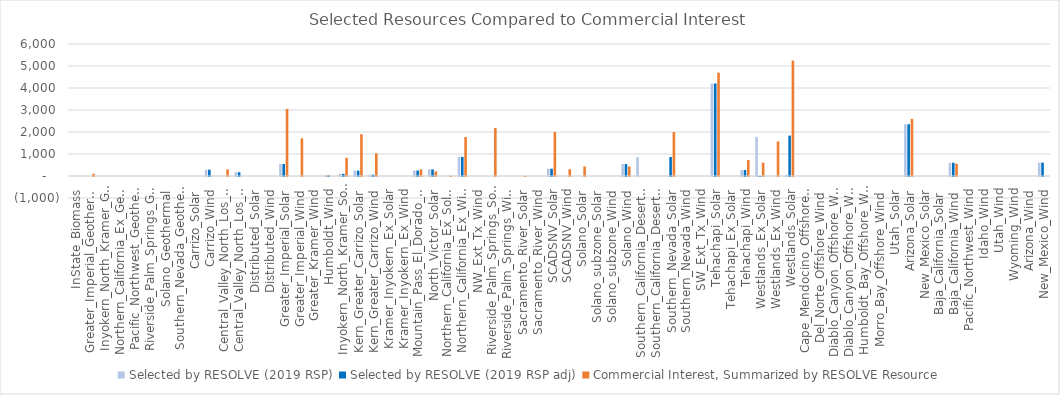
| Category | Selected by RESOLVE (2019 RSP) | Selected by RESOLVE (2019 RSP adj) |  Commercial Interest, Summarized by RESOLVE Resource  |
|---|---|---|---|
| InState_Biomass | 0 | 0 | 0 |
| Greater_Imperial_Geothermal | 0 | 0 | 100 |
| Inyokern_North_Kramer_Geothermal | 0 | 0 | 0 |
| Northern_California_Ex_Geothermal | 0 | 0 | 0 |
| Pacific_Northwest_Geothermal | 0 | 0 | 0 |
| Riverside_Palm_Springs_Geothermal | 0 | 0 | 0 |
| Solano_Geothermal | 0 | 0 | 0 |
| Southern_Nevada_Geothermal | 0 | 0 | 0 |
| Carrizo_Solar | 0 | 0 | 0 |
| Carrizo_Wind | 287 | 287 | 0 |
| Central_Valley_North_Los_Banos_Solar | 0 | 0 | 298.35 |
| Central_Valley_North_Los_Banos_Wind | 173 | 173 | 0 |
| Distributed_Solar | 0 | 0 | 0 |
| Distributed_Wind | 0 | 0 | 0 |
| Greater_Imperial_Solar | 547.9 | 547.9 | 3050.58 |
| Greater_Imperial_Wind | 0 | 0 | 1715.3 |
| Greater_Kramer_Wind | 0 | 0 | 0 |
| Humboldt_Wind | 34 | 34 | 0 |
| Inyokern_North_Kramer_Solar | 97 | 97 | 824.26 |
| Kern_Greater_Carrizo_Solar | 241.66 | 241.66 | 1898.196 |
| Kern_Greater_Carrizo_Wind | 60 | 60 | 1030.2 |
| Kramer_Inyokern_Ex_Solar | 0 | 0 | 0 |
| Kramer_Inyokern_Ex_Wind | 0 | 0 | 0 |
| Mountain_Pass_El_Dorado_Solar | 248 | 248 | 300 |
| North_Victor_Solar | 300 | 300 | 210.88 |
| Northern_California_Ex_Solar | 0 | 0 | 20.6 |
| Northern_California_Ex_Wind | 865.9 | 865.9 | 1774 |
| NW_Ext_Tx_Wind | 0 | 0 | 0 |
| Riverside_Palm_Springs_Solar | 0 | 0 | 2182 |
| Riverside_Palm_Springs_Wind | 0 | 0 | 0 |
| Sacramento_River_Solar | 0 | 0 | 12 |
| Sacramento_River_Wind | 0 | 0 | 0 |
| SCADSNV_Solar | 330 | 330 | 2000.104 |
| SCADSNV_Wind | 0 | 0 | 310 |
| Solano_Solar | 0 | 0 | 431.4 |
| Solano_subzone_Solar | 0 | 0 | 0 |
| Solano_subzone_Wind | 0 | 0 | 0 |
| Solano_Wind | 542 | 542 | 433.704 |
| Southern_California_Desert_Ex_Solar | 862 | 0 | 0 |
| Southern_California_Desert_Ex_Wind | 0 | 0 | 0 |
| Southern_Nevada_Solar | 0 | 862 | 2000.104 |
| Southern_Nevada_Wind | 0 | 0 | 0 |
| SW_Ext_Tx_Wind | 0 | 0 | 0 |
| Tehachapi_Solar | 4202 | 4202 | 4697.912 |
| Tehachapi_Ex_Solar | 0 | 0 | 0 |
| Tehachapi_Wind | 275 | 275 | 728.66 |
| Westlands_Ex_Solar | 1778.57 | -0.43 | 604.239 |
| Westlands_Ex_Wind | 0 | 0 | 1568 |
| Westlands_Solar | 58.21 | 1836.21 | 5245.997 |
| Cape_Mendocino_Offshore_Wind | 0 | 0 | 0 |
| Del_Norte_Offshore_Wind | 0 | 0 | 0 |
| Diablo_Canyon_Offshore_Wind_Ext_Tx | 0 | 0 | 0 |
| Diablo_Canyon_Offshore_Wind | 0 | 0 | 0 |
| Humboldt_Bay_Offshore_Wind | 0 | 0 | 0 |
| Morro_Bay_Offshore_Wind | 0 | 0 | 0 |
| Utah_Solar | 0 | 0 | 0 |
| Arizona_Solar | 2352.08 | 2352.08 | 2595 |
| New_Mexico_Solar | 0 | 0 | 0 |
| Baja_California_Solar | 0 | 0 | 0 |
| Baja_California_Wind | 600 | 600 | 556 |
| Pacific_Northwest_Wind | 0 | 0 | 0 |
| Idaho_Wind | 0 | 0 | 0 |
| Utah_Wind | 0 | 0 | 0 |
| Wyoming_Wind | 0 | 0 | 0 |
| Arizona_Wind | 0 | 0 | 0 |
| New_Mexico_Wind | 606.17 | 606.17 | 0 |